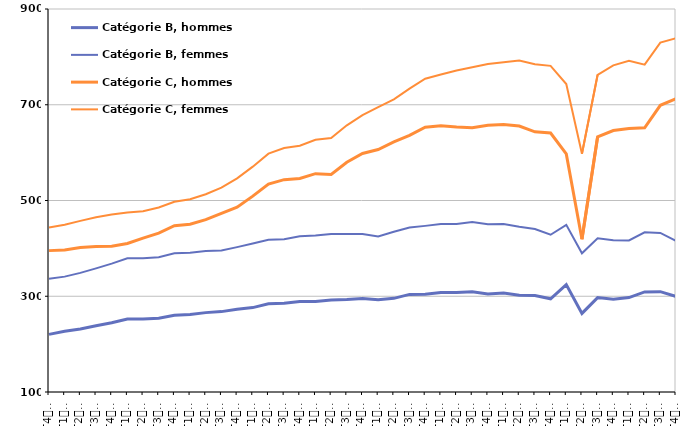
| Category | Catégorie B, hommes | Catégorie B, femmes | Catégorie C, hommes | Catégorie C, femmes |
|---|---|---|---|---|
| T4
2011 | 220.4 | 336.7 | 395.3 | 443.8 |
| T1
2012 | 226.8 | 341 | 396.6 | 449.4 |
| T2
2012 | 231.6 | 348.8 | 402 | 457.5 |
| T3
2012 | 238.3 | 358.3 | 403.9 | 465 |
| T4
2012 | 244.8 | 368.1 | 404.3 | 470.6 |
| T1
2013 | 252.6 | 379.3 | 410.3 | 475 |
| T2
2013 | 252.5 | 379.6 | 421.4 | 477.5 |
| T3
2013 | 254 | 381.5 | 432 | 485.3 |
| T4
2013 | 260.4 | 389.8 | 447.3 | 497.4 |
| T1
2014 | 262 | 390.7 | 450.5 | 502.6 |
| T2
2014 | 265.8 | 394.6 | 459.9 | 513.1 |
| T3
2014 | 267.9 | 395.7 | 473.3 | 526.7 |
| T4
2014 | 273 | 402.6 | 486 | 546.3 |
| T1
2015 | 276.3 | 410 | 509.1 | 570.7 |
| T2
2015 | 284.2 | 417.8 | 534.4 | 597.9 |
| T3
2015 | 285.6 | 419.2 | 543.5 | 609.7 |
| T4
2015 | 289 | 425.3 | 546.1 | 614.3 |
| T1
2016 | 288.8 | 426.7 | 556.1 | 626.9 |
| T2
2016 | 292.4 | 430.1 | 554.4 | 630.5 |
| T3
2016 | 293.1 | 430.1 | 580 | 657.1 |
| T4
2016 | 295.4 | 430 | 598.2 | 678.5 |
| T1
2017 | 292.6 | 424.9 | 606.4 | 695.1 |
| T2
2017 | 295.6 | 434.6 | 622.4 | 711.3 |
| T3
2017 | 303.9 | 443.4 | 636.1 | 733.7 |
| T4
2017 | 304.2 | 447 | 653.1 | 754.5 |
| T1
2018 | 308 | 450.9 | 655.9 | 763.1 |
| T2
2018 | 308 | 451.1 | 653.3 | 771.5 |
| T3
2018 | 309.3 | 455.3 | 651.9 | 778.5 |
| T4
2018 | 304.9 | 450.5 | 657.3 | 785.3 |
| T1
2019 | 306.9 | 450.9 | 658.8 | 789 |
| T2
2019 | 302 | 445.2 | 655.6 | 792.3 |
| T3
2019 | 301.6 | 440.5 | 643.4 | 784.5 |
| T4
2019 | 294.7 | 428.5 | 640.9 | 781.2 |
| T1
2020 | 324.4 | 449.2 | 597.3 | 743.2 |
| T2
2020 | 264.2 | 389.8 | 419 | 597.7 |
| T3
2020 | 297.2 | 421 | 633.1 | 762.6 |
| T4
2020 | 294 | 416.8 | 646.2 | 782.4 |
| T1
2021 | 297.2 | 416.7 | 650.6 | 791.9 |
| T2
2021 | 309 | 433.7 | 651.9 | 783.7 |
| T3
2021 | 309.6 | 432.3 | 698.9 | 829.7 |
| T4
2021 | 299.5 | 415.5 | 712.4 | 839.1 |